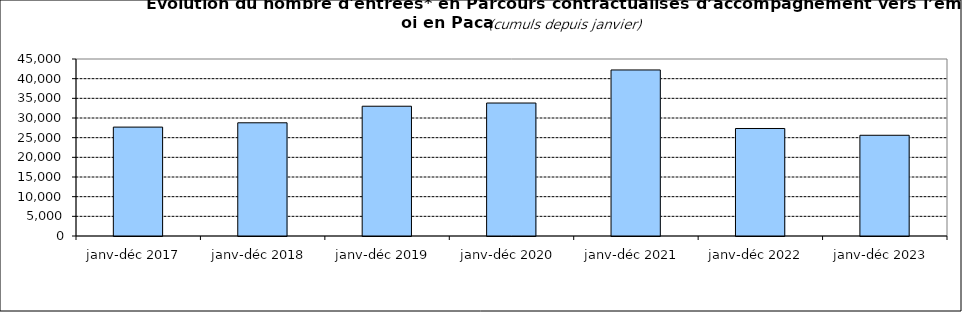
| Category | Series 1 |
|---|---|
| janv-déc 2017  | 27687 |
| janv-déc 2018  | 28782 |
| janv-déc 2019  | 32995 |
| janv-déc 2020  | 33807 |
| janv-déc 2021  | 42214 |
| janv-déc 2022  | 27331 |
| janv-déc 2023  | 25609 |